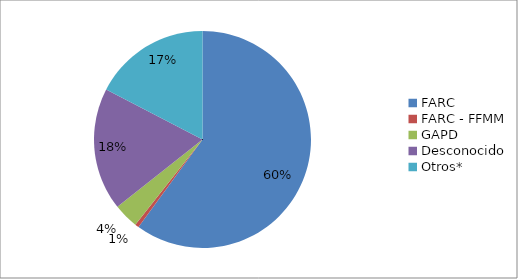
| Category | Series 0 |
|---|---|
| FARC | 0.6 |
| FARC - FFMM | 0.006 |
| GAPD | 0.037 |
| Desconocido | 0.183 |
| Otros* | 0.174 |